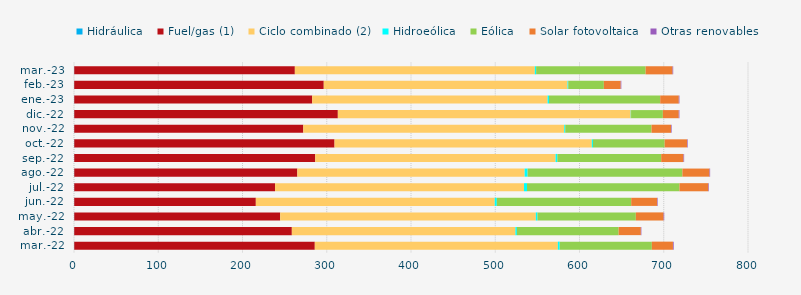
| Category | Hidráulica | Fuel/gas (1) | Ciclo combinado (2) | Hidroeólica | Eólica | Solar fotovoltaica | Otras renovables |
|---|---|---|---|---|---|---|---|
| mar.-22 | 0.296 | 285.515 | 288.521 | 2.126 | 109.415 | 25.048 | 0.91 |
| abr.-22 | 0.274 | 258.292 | 265.373 | 1.753 | 120.739 | 26.389 | 0.614 |
| may.-22 | 0.299 | 244.426 | 303.457 | 1.917 | 116.774 | 32.969 | 0.721 |
| jun.-22 | 0.281 | 215.547 | 283.584 | 2.45 | 159.505 | 30.724 | 0.696 |
| jul.-22 | 0.294 | 238.317 | 295.517 | 3.563 | 180.965 | 34.259 | 0.688 |
| ago.-22 | 0.293 | 264.803 | 269.791 | 3.518 | 183.708 | 32.217 | 0.715 |
| sep.-22 | 0.289 | 286.046 | 285.298 | 2.075 | 123.261 | 26.5 | 0.715 |
| oct.-22 | 0.294 | 308.951 | 305.386 | 1.35 | 85.114 | 26.618 | 0.731 |
| nov.-22 | 0.277 | 271.883 | 309.743 | 1.169 | 102.415 | 23.099 | 0.765 |
| dic.-22 | 0.289 | 312.877 | 347.662 | 0.367 | 37.762 | 18.863 | 0.785 |
| ene.-23 | 0.275 | 282.444 | 279.419 | 1.65 | 132 | 22.059 | 0.784 |
| feb.-23 | 0.254 | 296.204 | 289.333 | 0.829 | 42.28 | 20.025 | 0.711 |
| mar.-23 | 0.29 | 261.841 | 284.831 | 1.572 | 129.959 | 31.987 | 0.738 |